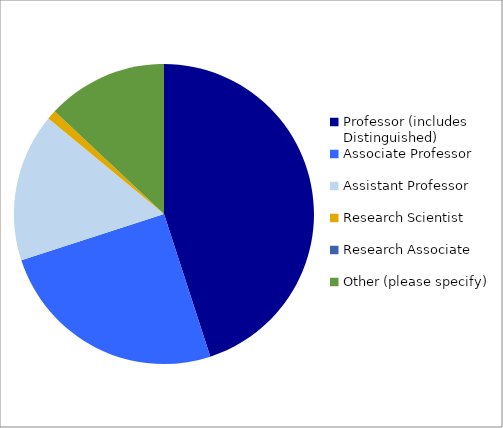
| Category | Series 0 |
|---|---|
| Professor (includes Distinguished) | 0.45 |
| Associate Professor | 0.25 |
| Assistant Professor | 0.16 |
| Research Scientist | 0.01 |
| Research Associate | 0 |
| Other (please specify) | 0.13 |